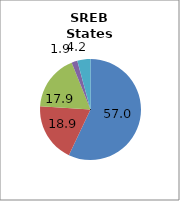
| Category | 50 states and D.C. |
|---|---|
| White | 57.047 |
| Black | 18.947 |
| Hispanic | 17.929 |
| Two or More Races | 1.856 |
| All Other1 | 4.22 |